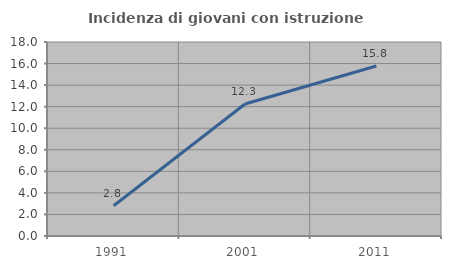
| Category | Incidenza di giovani con istruzione universitaria |
|---|---|
| 1991.0 | 2.809 |
| 2001.0 | 12.251 |
| 2011.0 | 15.773 |